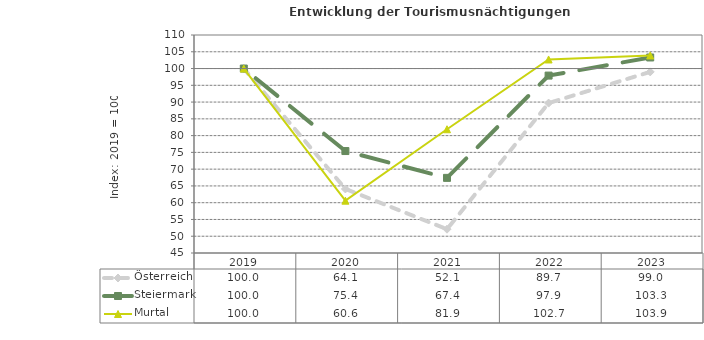
| Category | Österreich | Steiermark | Murtal |
|---|---|---|---|
| 2023.0 | 99 | 103.3 | 103.9 |
| 2022.0 | 89.7 | 97.9 | 102.7 |
| 2021.0 | 52.1 | 67.4 | 81.9 |
| 2020.0 | 64.1 | 75.4 | 60.6 |
| 2019.0 | 100 | 100 | 100 |